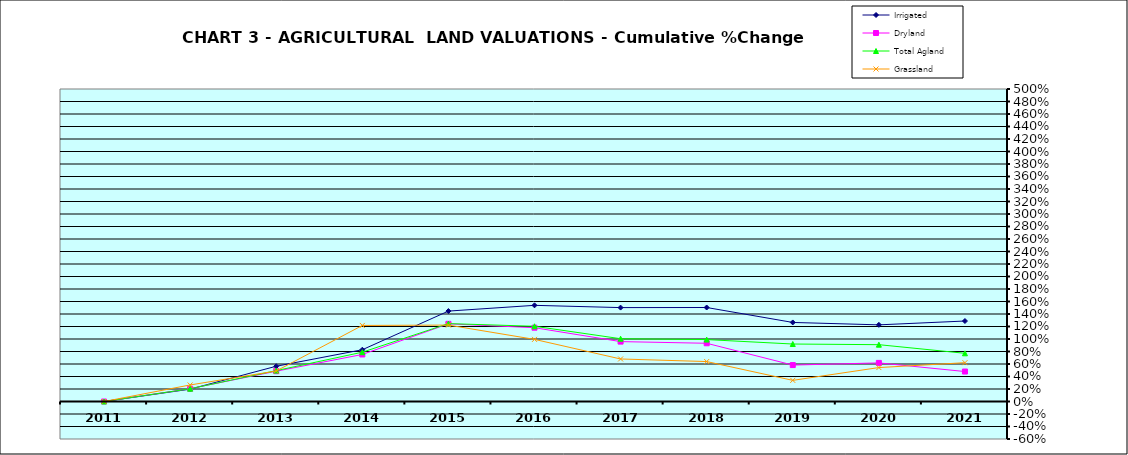
| Category | Irrigated | Dryland | Total Agland | Grassland |
|---|---|---|---|---|
| 2011.0 | 0 | 0 | 0 | 0 |
| 2012.0 | 0.198 | 0.205 | 0.204 | 0.265 |
| 2013.0 | 0.564 | 0.485 | 0.494 | 0.488 |
| 2014.0 | 0.828 | 0.752 | 0.789 | 1.217 |
| 2015.0 | 1.447 | 1.243 | 1.246 | 1.223 |
| 2016.0 | 1.539 | 1.181 | 1.204 | 0.994 |
| 2017.0 | 1.502 | 0.958 | 1.005 | 0.68 |
| 2018.0 | 1.504 | 0.932 | 0.991 | 0.639 |
| 2019.0 | 1.265 | 0.583 | 0.92 | 0.338 |
| 2020.0 | 1.226 | 0.618 | 0.909 | 0.543 |
| 2021.0 | 1.288 | 0.479 | 0.771 | 0.621 |